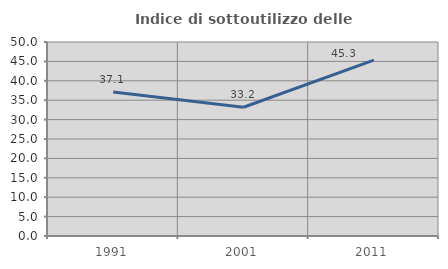
| Category | Indice di sottoutilizzo delle abitazioni  |
|---|---|
| 1991.0 | 37.104 |
| 2001.0 | 33.186 |
| 2011.0 | 45.344 |